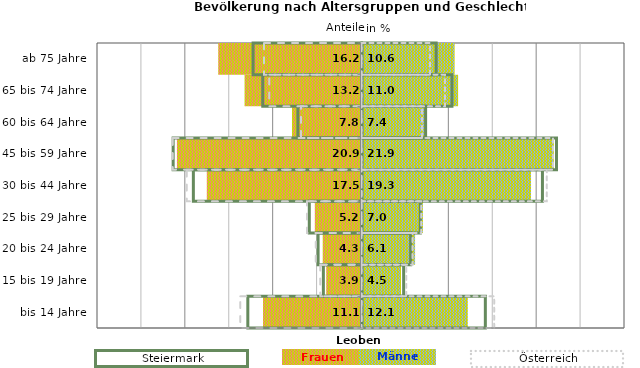
| Category | Frauen | Männer | Frauen Spalte2 | Männer Spalte2 | Frauen Spalte3 | Männer Spalte3 |
|---|---|---|---|---|---|---|
| bis 14 Jahre | -11.1 | 12.1 | 14.1 | -13 | -13.8 | 15.1 |
| 15 bis 19 Jahre | -3.9 | 4.5 | 4.8 | -4.4 | -4.7 | 5.1 |
| 20 bis 24 Jahre | -4.3 | 6.1 | 5.6 | -5 | -5.2 | 5.8 |
| 25 bis 29 Jahre | -5.2 | 7 | 6.7 | -6 | -6.2 | 6.8 |
| 30 bis 44 Jahre | -17.5 | 19.3 | 20.6 | -19.2 | -19.9 | 21.1 |
| 45 bis 59 Jahre | -20.9 | 21.9 | 22.2 | -21.5 | -21.5 | 21.8 |
| 60 bis 64 Jahre | -7.8 | 7.4 | 7.3 | -7.3 | -6.9 | 6.9 |
| 65 bis 74 Jahre | -13.2 | 11 | 10.3 | -11.3 | -10.5 | 9.5 |
| ab 75 Jahre | -16.2 | 10.6 | 8.5 | -12.4 | -11.1 | 7.8 |